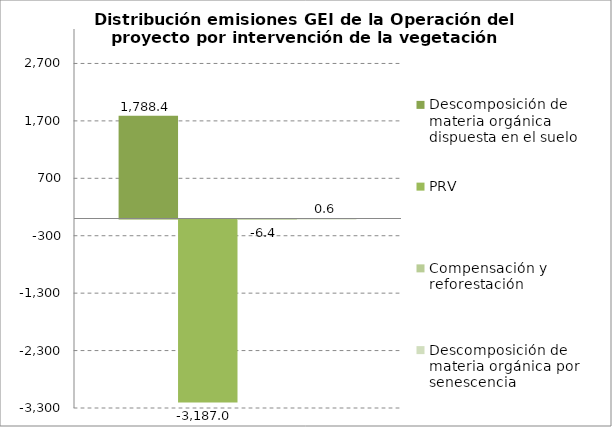
| Category | Descomposición de materia orgánica dispuesta en el suelo | PRV | Compensación y reforestación | Descomposición de materia orgánica por senescencia |
|---|---|---|---|---|
| 0 | 1788.392 | -3187.03 | -6.433 | 0.615 |